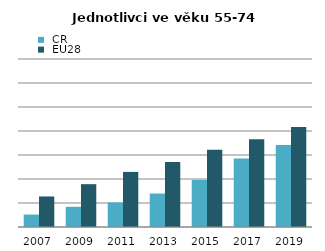
| Category |  ČR |  EU28 |
|---|---|---|
| 2007.0 | 5.185 | 12.731 |
| 2009.0 | 8.417 | 17.85 |
| 2011.0 | 10.223 | 22.96 |
| 2013.0 | 13.95 | 27.092 |
| 2015.0 | 19.594 | 32.197 |
| 2017.0 | 28.575 | 36.516 |
| 2019.0 | 34.2 | 41.7 |